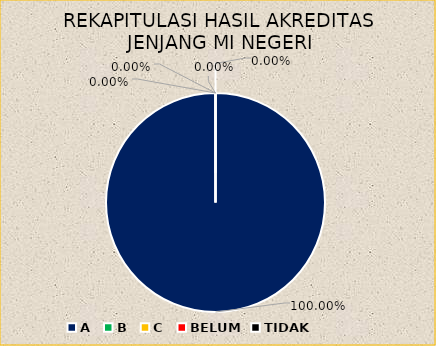
| Category | REKAPITULASI HASIL AKREDITASI JENJANG MI NEGERI |
|---|---|
| A | 7 |
| B | 0 |
| C | 0 |
| BELUM | 0 |
| TIDAK | 0 |